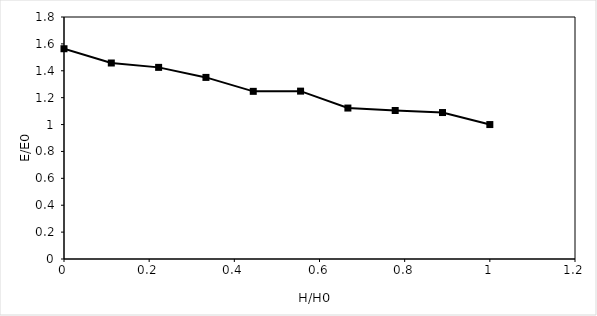
| Category | Head (feet) |
|---|---|
| 1.0 | 1 |
| 0.8888888888888888 | 1.089 |
| 0.7777777777777778 | 1.105 |
| 0.6666666666666666 | 1.123 |
| 0.5555555555555556 | 1.249 |
| 0.4444444444444444 | 1.247 |
| 0.3333333333333333 | 1.351 |
| 0.2222222222222222 | 1.425 |
| 0.1111111111111111 | 1.458 |
| 0.0 | 1.564 |